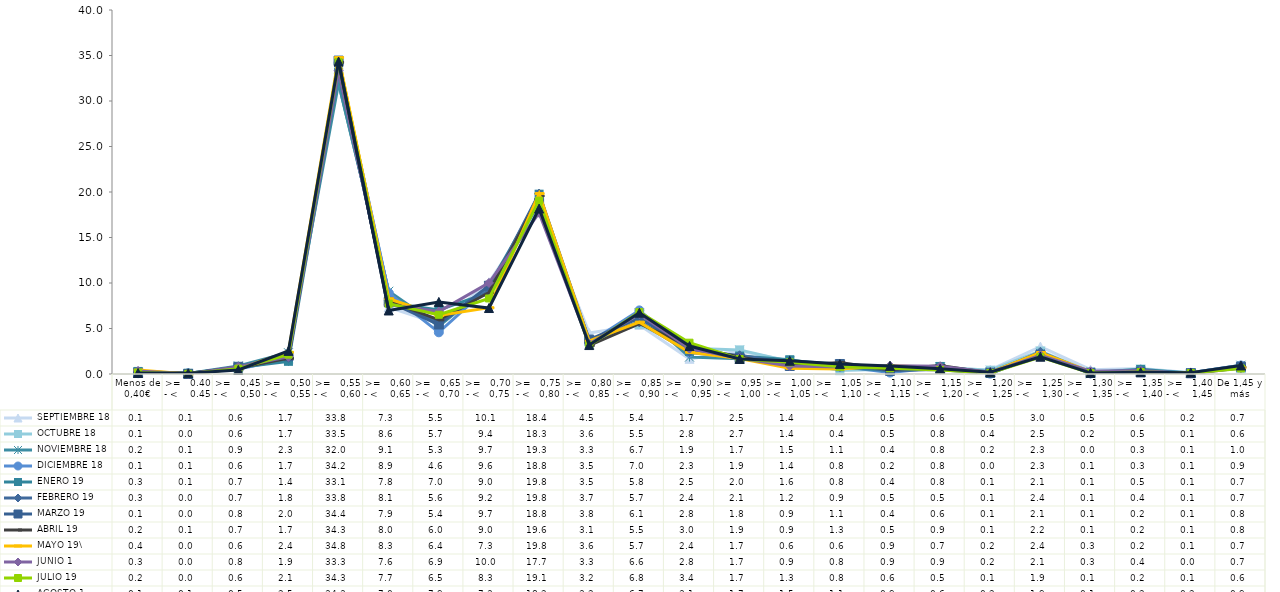
| Category |  SEPTIEMBRE 18 |  OCTUBRE 18 |  NOVIEMBRE 18 |  DICIEMBRE 18 |  ENERO 19 |  FEBRERO 19 |  MARZO 19 |  ABRIL 19 |  MAYO 19\ |  JUNIO 1 |  JULIO 19 |  AGOSTO 1 |
|---|---|---|---|---|---|---|---|---|---|---|---|---|
| Menos de 0,40€ | 0.12 | 0.08 | 0.22 | 0.09 | 0.28 | 0.29 | 0.11 | 0.2 | 0.43 | 0.33 | 0.16 | 0.11 |
| >=   0.40 - <    0.45 | 0.05 | 0.02 | 0.06 | 0.08 | 0.08 | 0.03 | 0.01 | 0.07 | 0.01 | 0 | 0.02 | 0.08 |
| >=   0,45 - <    0,50 | 0.56 | 0.62 | 0.89 | 0.55 | 0.7 | 0.72 | 0.79 | 0.66 | 0.58 | 0.79 | 0.59 | 0.45 |
| >=   0,50 - <    0,55 | 1.74 | 1.68 | 2.34 | 1.69 | 1.39 | 1.76 | 1.95 | 1.72 | 2.39 | 1.89 | 2.13 | 2.54 |
| >=   0,55 - <    0,60 | 33.82 | 33.53 | 31.95 | 34.18 | 33.12 | 33.84 | 34.44 | 34.25 | 34.77 | 33.32 | 34.29 | 34.34 |
| >=   0,60 - <    0,65 | 7.33 | 8.6 | 9.09 | 8.9 | 7.82 | 8.12 | 7.92 | 8.04 | 8.27 | 7.61 | 7.73 | 6.98 |
| >=   0,65 - <   0,70 | 5.51 | 5.71 | 5.27 | 4.58 | 7.04 | 5.62 | 5.44 | 5.95 | 6.43 | 6.86 | 6.51 | 7.92 |
| >=   0,70 - <   0,75 | 10.08 | 9.41 | 9.66 | 9.58 | 8.95 | 9.18 | 9.7 | 8.96 | 7.28 | 10.01 | 8.3 | 7.25 |
| >=   0,75 - <   0,80 | 18.35 | 18.26 | 19.33 | 18.79 | 19.76 | 19.83 | 18.81 | 19.56 | 19.83 | 17.71 | 19.05 | 18.18 |
| >=   0,80 - <   0,85 | 4.51 | 3.62 | 3.33 | 3.47 | 3.53 | 3.67 | 3.78 | 3.13 | 3.63 | 3.33 | 3.15 | 3.18 |
| >=   0,85 - <   0,90 | 5.39 | 5.45 | 6.71 | 6.99 | 5.76 | 5.67 | 6.14 | 5.54 | 5.7 | 6.6 | 6.8 | 6.73 |
| >=   0,90 - <    0,95 | 1.67 | 2.84 | 1.86 | 2.33 | 2.48 | 2.41 | 2.83 | 3.03 | 2.39 | 2.78 | 3.44 | 3.07 |
| >=   0,95 - <   1,00 | 2.52 | 2.65 | 1.67 | 1.91 | 1.97 | 2.06 | 1.75 | 1.86 | 1.69 | 1.74 | 1.65 | 1.65 |
| >=   1,00 - <   1,05 | 1.44 | 1.37 | 1.45 | 1.35 | 1.57 | 1.22 | 0.88 | 0.92 | 0.63 | 0.88 | 1.28 | 1.45 |
| >=   1,05 - <    1,10 | 0.41 | 0.42 | 1.06 | 0.84 | 0.78 | 0.85 | 1.1 | 1.27 | 0.56 | 0.78 | 0.79 | 1.09 |
| >=   1,10 - <   1,15 | 0.54 | 0.52 | 0.42 | 0.16 | 0.36 | 0.47 | 0.35 | 0.46 | 0.91 | 0.91 | 0.63 | 0.89 |
| >=   1,15 - <    1,20 | 0.6 | 0.75 | 0.77 | 0.75 | 0.83 | 0.47 | 0.56 | 0.93 | 0.71 | 0.85 | 0.45 | 0.58 |
| >=   1,20 - <    1,25 | 0.45 | 0.42 | 0.24 | 0.04 | 0.06 | 0.07 | 0.14 | 0.11 | 0.17 | 0.18 | 0.12 | 0.19 |
| >=   1,25 - <    1,30 | 3.01 | 2.52 | 2.27 | 2.26 | 2.08 | 2.44 | 2.1 | 2.19 | 2.36 | 2.06 | 1.87 | 1.9 |
| >=   1,30 - <    1,35 | 0.47 | 0.24 | 0.03 | 0.06 | 0.14 | 0.14 | 0.13 | 0.11 | 0.26 | 0.3 | 0.1 | 0.12 |
| >=   1,35 - <    1,40 | 0.6 | 0.52 | 0.31 | 0.33 | 0.51 | 0.36 | 0.2 | 0.19 | 0.16 | 0.38 | 0.22 | 0.19 |
| >=   1,40 - <    1,45 | 0.15 | 0.14 | 0.13 | 0.13 | 0.06 | 0.09 | 0.08 | 0.1 | 0.14 | 0.04 | 0.11 | 0.15 |
| De 1,45 y más | 0.67 | 0.64 | 0.96 | 0.93 | 0.74 | 0.69 | 0.8 | 0.75 | 0.68 | 0.67 | 0.61 | 0.94 |